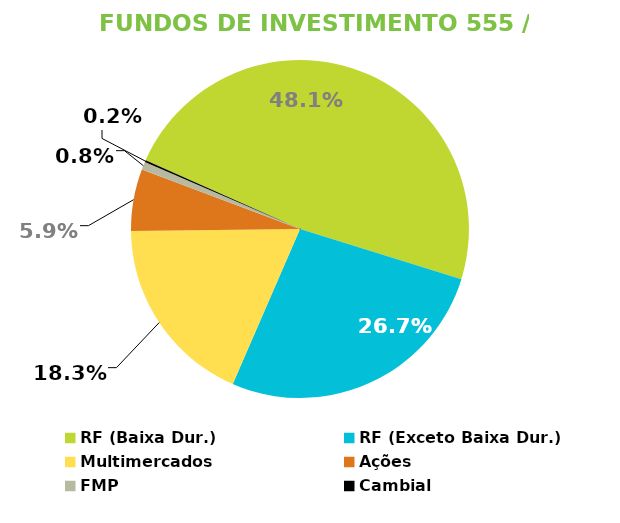
| Category | Fundos de Investimento 555 / FMP |
|---|---|
| RF (Baixa Dur.) | 0.481 |
| RF (Exceto Baixa Dur.) | 0.267 |
| Multimercados | 0.183 |
| Ações | 0.059 |
| FMP | 0.008 |
| Cambial | 0.002 |